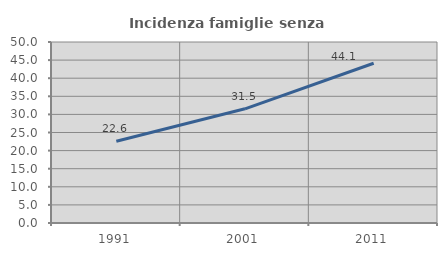
| Category | Incidenza famiglie senza nuclei |
|---|---|
| 1991.0 | 22.585 |
| 2001.0 | 31.546 |
| 2011.0 | 44.131 |